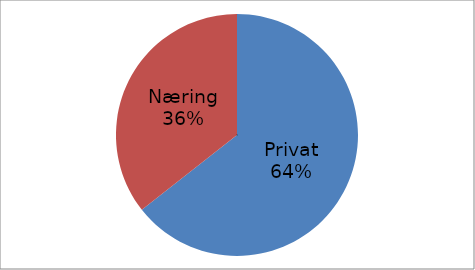
| Category | Series 0 |
|---|---|
| Privat | 36006873 |
| Næring | 19900065 |